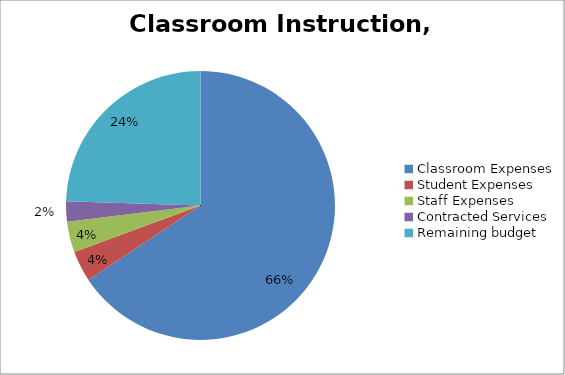
| Category | Series 0 |
|---|---|
| Classroom Expenses | 9427.357 |
| Student Expenses | 530.934 |
| Staff Expenses | 530.934 |
| Contracted Services | 347.989 |
| Remaining budget  | 3517.61 |